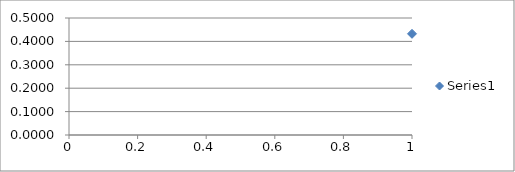
| Category | Series 0 |
|---|---|
| 0 | 0.432 |
| 1 | 0.157 |
| 2 | 0.099 |
| 3 | 0.039 |